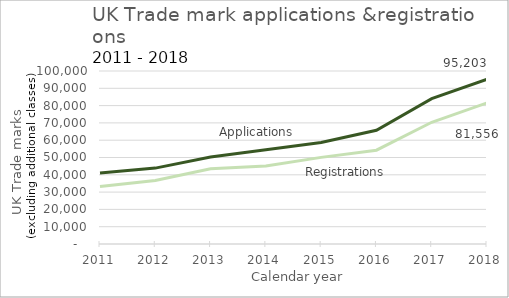
| Category | Applications | Registrations |
|---|---|---|
| 2011.0 | 41044 | 33172 |
| 2012.0 | 43873 | 36755 |
| 2013.0 | 50331 | 43548 |
| 2014.0 | 54498 | 45123 |
| 2015.0 | 58627 | 50079 |
| 2016.0 | 65710 | 54222 |
| 2017.0 | 83984 | 70362 |
| 2018.0 | 95203 | 81556 |